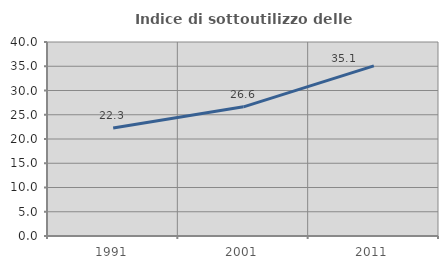
| Category | Indice di sottoutilizzo delle abitazioni  |
|---|---|
| 1991.0 | 22.28 |
| 2001.0 | 26.634 |
| 2011.0 | 35.088 |